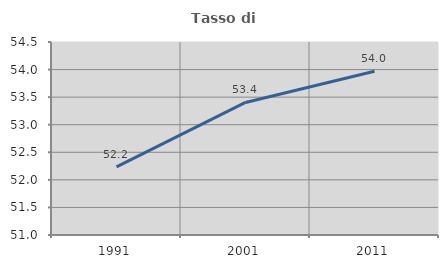
| Category | Tasso di occupazione   |
|---|---|
| 1991.0 | 52.236 |
| 2001.0 | 53.403 |
| 2011.0 | 53.968 |